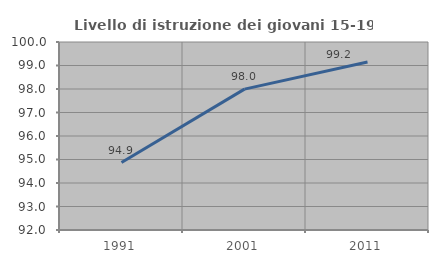
| Category | Livello di istruzione dei giovani 15-19 anni |
|---|---|
| 1991.0 | 94.872 |
| 2001.0 | 97.994 |
| 2011.0 | 99.153 |